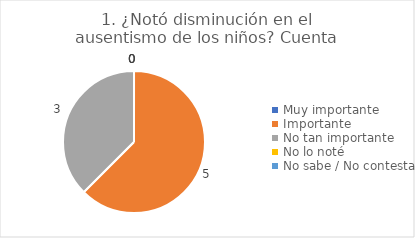
| Category | 1. ¿Notó disminución en el ausentismo de los niños? |
|---|---|
| Muy importante  | 0 |
| Importante  | 0.625 |
| No tan importante  | 0.375 |
| No lo noté  | 0 |
| No sabe / No contesta | 0 |